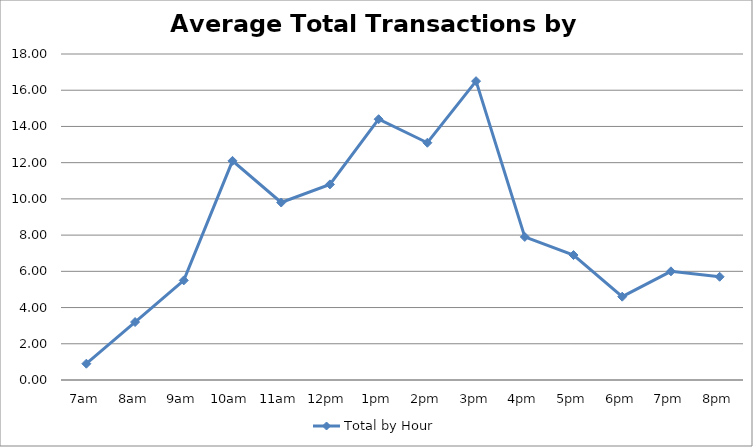
| Category | Total by Hour |
|---|---|
| 7am | 0.9 |
| 8am | 3.2 |
| 9am | 5.5 |
| 10am | 12.1 |
| 11am | 9.8 |
| 12pm | 10.8 |
| 1pm | 14.4 |
| 2pm | 13.1 |
| 3pm | 16.5 |
| 4pm | 7.9 |
| 5pm | 6.9 |
| 6pm | 4.6 |
| 7pm | 6 |
| 8pm | 5.7 |